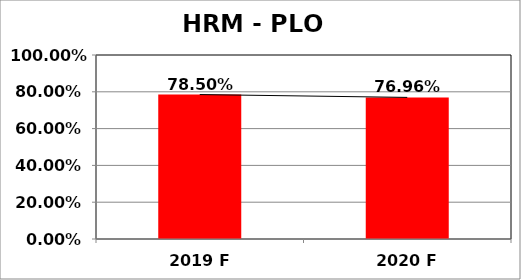
| Category | Series 0 |
|---|---|
| 2019 F | 0.785 |
| 2020 F | 0.77 |